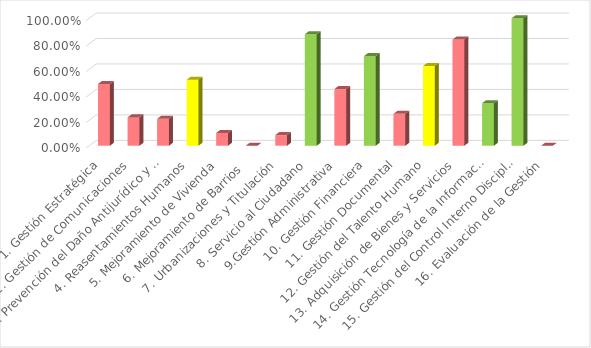
| Category | Calificación |
|---|---|
| 1. Gestión Estratégica | 0.485 |
| 2. Gestión de Comunicaciones | 0.222 |
| 3. Prevención del Daño Antijurídico y Representación Judicial | 0.211 |
| 4. Reasentamientos Humanos | 0.518 |
| 5. Mejoramiento de Vivienda | 0.1 |
| 6. Mejoramiento de Barrios  | 0 |
| 7. Urbanizaciones y Titulación | 0.083 |
| 8. Servicio al Ciudadano | 0.875 |
| 9.Gestión Administrativa | 0.444 |
| 10. Gestión Financiera | 0.703 |
| 11. Gestión Documental | 0.25 |
| 12. Gestión del Talento Humano | 0.625 |
| 13. Adquisición de Bienes y Servicios | 0.833 |
| 14. Gestión Tecnología de la Información y Comunicaciones  | 0.333 |
| 15. Gestión del Control Interno Disciplinario | 1 |
| 16. Evaluación de la Gestión | 0 |